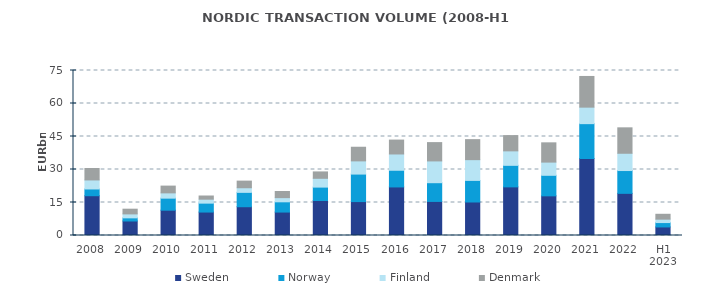
| Category | Sweden | Norway | Finland | Denmark |
|---|---|---|---|---|
| 2008 | 18.086 | 3.064 | 4.1 | 5.218 |
| 2009 | 6.597 | 1.423 | 1.8 | 2.141 |
| 2010 | 11.505 | 5.471 | 2.4 | 3.077 |
| 2011 | 10.657 | 4.049 | 1.8 | 1.446 |
| 2012 | 13.08 | 6.529 | 2.1 | 3.01 |
| 2013 | 10.654 | 4.661 | 1.9 | 2.784 |
| 2014 | 15.914 | 6.084 | 4 | 2.903 |
| 2015 | 15.417 | 12.5 | 6 | 6.2 |
| 2016 | 22.076 | 7.574 | 7.406 | 6.317 |
| 2017 | 15.489 | 8.511 | 9.9 | 8.325 |
| 2018 | 15.231 | 9.812 | 9.435 | 9.094 |
| 2019 | 22.101 | 9.791 | 6.577 | 6.942 |
| 2020 | 18.027 | 9.334 | 5.998 | 8.76 |
| 2021 | 34.993 | 15.847 | 7.497 | 13.953 |
| 2022 | 19.161 | 10.366 | 7.854 | 11.56 |
| H1 2023 | 3.888 | 1.989 | 1.55 | 2.216 |